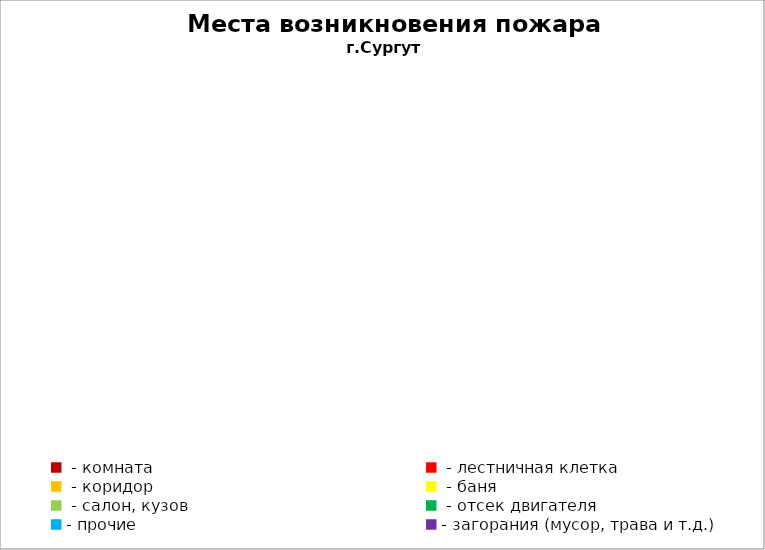
| Category | Места возникновения пожара |
|---|---|
|  - комната | 79 |
|  - лестничная клетка | 15 |
|  - коридор | 11 |
|  - баня | 42 |
|  - салон, кузов | 28 |
|  - отсек двигателя | 48 |
| - прочие | 108 |
| - загорания (мусор, трава и т.д.)  | 164 |